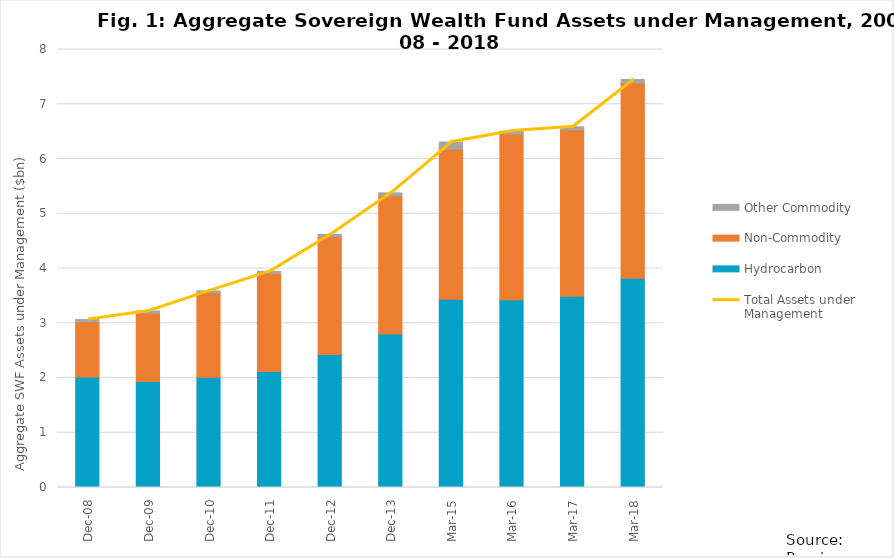
| Category | Hydrocarbon | Non-Commodity | Other Commodity |
|---|---|---|---|
| 2008-12-01 | 2.016 | 1.012 | 0.04 |
| 2009-12-01 | 1.938 | 1.245 | 0.041 |
| 2010-12-01 | 2.015 | 1.543 | 0.034 |
| 2011-12-01 | 2.119 | 1.791 | 0.038 |
| 2012-12-01 | 2.427 | 2.151 | 0.044 |
| 2013-12-01 | 2.805 | 2.52 | 0.057 |
| 2015-03-01 | 3.44 | 2.74 | 0.13 |
| 2016-03-01 | 3.43 | 3.026 | 0.05 |
| 2017-03-01 | 3.492 | 3.04 | 0.055 |
| 2018-03-01 | 3.822 | 3.57 | 0.061 |